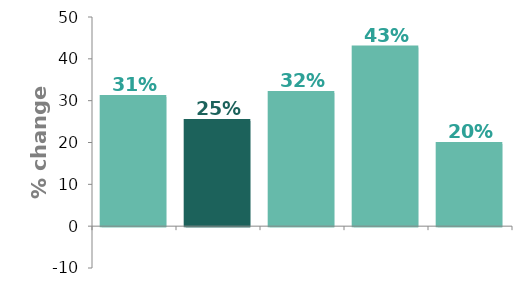
| Category | Series 0 |
|---|---|
| UK | 30.873 |
| Scotland | 25.11 |
| England | 31.823 |
| Northern Ireland | 42.697 |
| Wales | 19.626 |